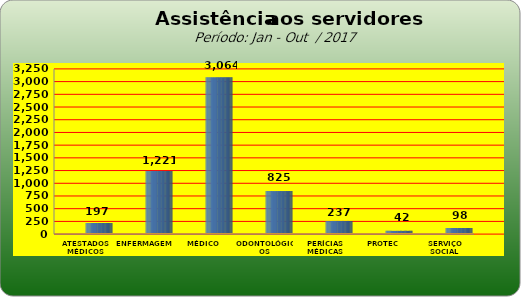
| Category | Series 0 |
|---|---|
| ATESTADOS MÉDICOS | 197 |
| ENFERMAGEM | 1221 |
| MÉDICO | 3064 |
| ODONTOLÓGICOS | 825 |
| PERÍCIAS MÉDICAS | 237 |
| PROTEC | 42 |
| SERVIÇO SOCIAL | 98 |